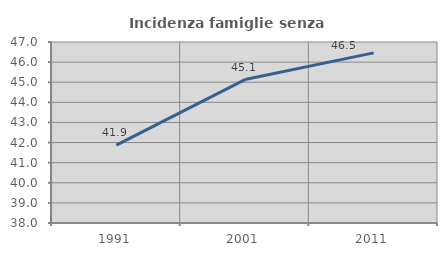
| Category | Incidenza famiglie senza nuclei |
|---|---|
| 1991.0 | 41.869 |
| 2001.0 | 45.133 |
| 2011.0 | 46.459 |